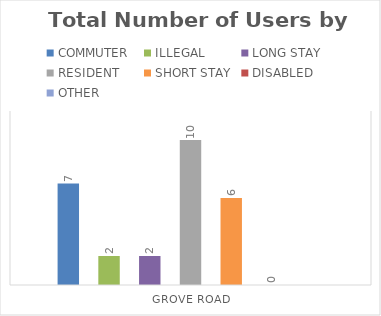
| Category | COMMUTER | ILLEGAL | LONG STAY | RESIDENT | SHORT STAY | DISABLED | OTHER |
|---|---|---|---|---|---|---|---|
| GROVE ROAD | 7 | 2 | 2 | 10 | 6 | 0 | 0 |